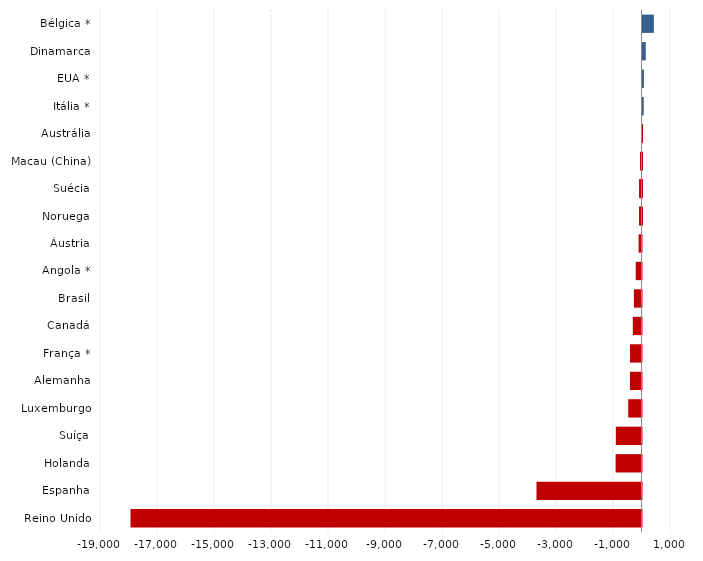
| Category | Series 0 |
|---|---|
| Reino Unido | -17929 |
| Espanha | -3684 |
| Holanda | -908 |
| Suíça | -901 |
| Luxemburgo | -466 |
| Alemanha | -405 |
| França * | -404 |
| Canadá | -305 |
| Brasil | -266 |
| Angola * | -202 |
| Áustria | -101 |
| Noruega | -88 |
| Suécia | -80 |
| Macau (China) | -48 |
| Austrália | -16 |
| Itália * | 44 |
| EUA * | 51 |
| Dinamarca | 116 |
| Bélgica * | 399 |